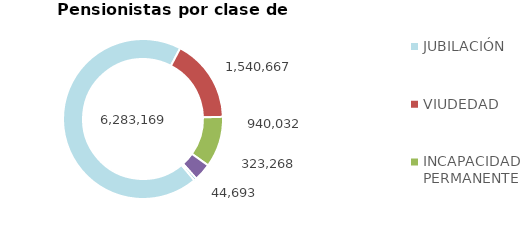
| Category | Series 0 |
|---|---|
| JUBILACIÓN | 6283169 |
| VIUDEDAD | 1540667 |
| INCAPACIDAD PERMANENTE | 940032 |
| ORFANDAD | 323268 |
| FAVOR DE FAMILIARES | 44693 |